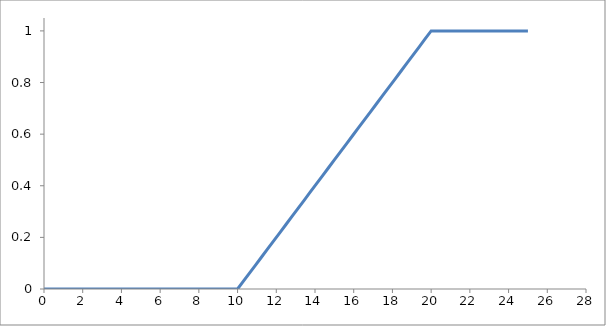
| Category | Series 0 |
|---|---|
| 0.0 | 0 |
| 10.0 | 0 |
| 10.3125 | 0.031 |
| 10.625 | 0.062 |
| 10.9375 | 0.094 |
| 11.25 | 0.125 |
| 11.5625 | 0.156 |
| 11.875 | 0.188 |
| 12.1875 | 0.219 |
| 12.5 | 0.25 |
| 12.8125 | 0.281 |
| 13.125 | 0.312 |
| 13.4375 | 0.344 |
| 13.75 | 0.375 |
| 14.0625 | 0.406 |
| 14.375 | 0.438 |
| 14.6875 | 0.469 |
| 15.0 | 0.5 |
| 15.3125 | 0.531 |
| 15.625 | 0.562 |
| 15.9375 | 0.594 |
| 16.25 | 0.625 |
| 16.5625 | 0.656 |
| 16.875 | 0.688 |
| 17.1875 | 0.719 |
| 17.5 | 0.75 |
| 17.8125 | 0.781 |
| 18.125 | 0.812 |
| 18.4375 | 0.844 |
| 18.75 | 0.875 |
| 19.0625 | 0.906 |
| 19.375 | 0.938 |
| 19.6875 | 0.969 |
| 20.0 | 1 |
| 25.0 | 1 |